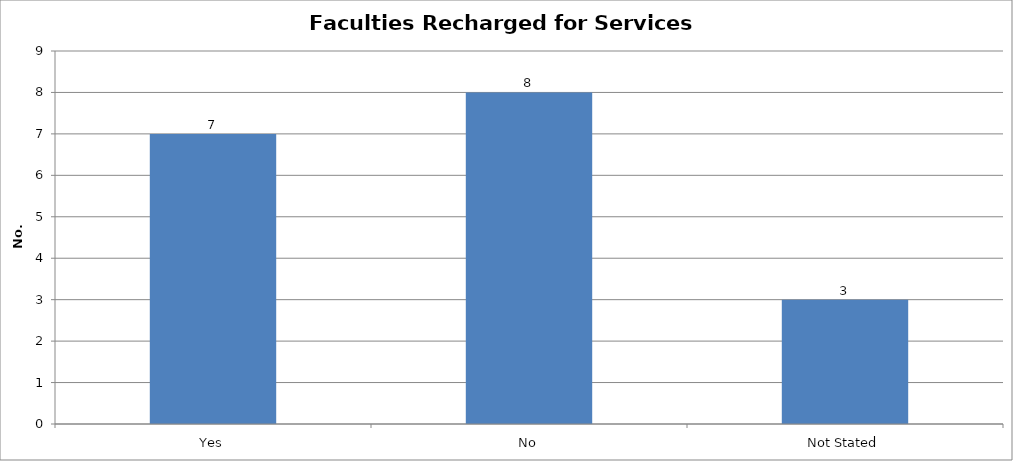
| Category | Yes |
|---|---|
| Yes | 7 |
| No | 8 |
| Not Stated | 3 |